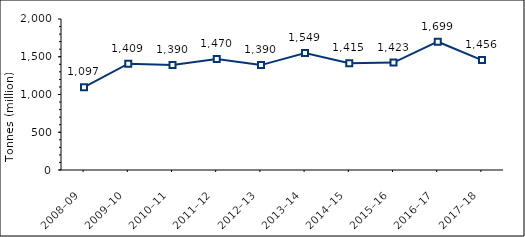
| Category | Total metals† |
|---|---|
| 2008–09 | 1097433 |
| 2009–10 | 1408712 |
| 2010–11 | 1389996 |
| 2011–12 | 1470493 |
| 2012–13 | 1389518 |
| 2013–14 | 1548665 |
| 2014–15 | 1415153 |
| 2015–16 | 1422679 |
| 2016–17 | 1699132 |
| 2017–18 | 1455579 |